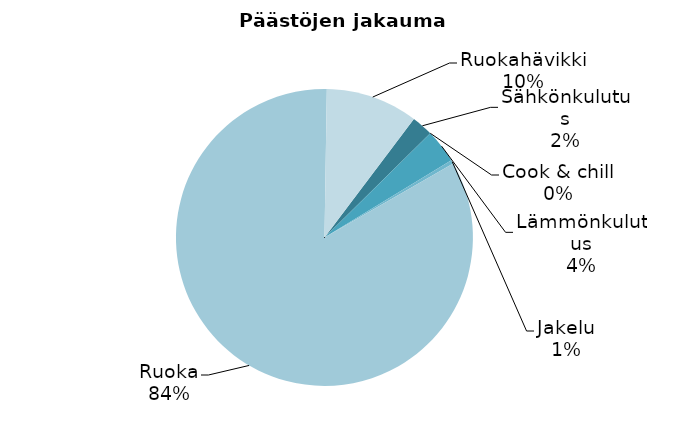
| Category | Series 0 |
|---|---|
| Sähkönkulutus | 33.348 |
| Cook & chill | 0 |
| Lämmönkulutus | 52.37 |
| Jakelu | 5.678 |
| Ruoka | 1190 |
| Ruokahävikki | 142.8 |